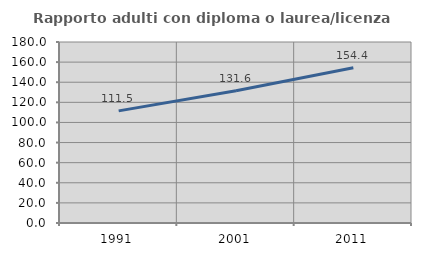
| Category | Rapporto adulti con diploma o laurea/licenza media  |
|---|---|
| 1991.0 | 111.494 |
| 2001.0 | 131.582 |
| 2011.0 | 154.402 |